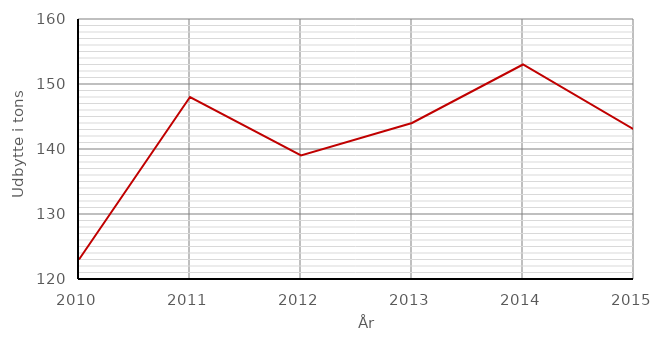
| Category | Series 0 |
|---|---|
| 2010 | 123 |
| 2011 | 148 |
| 2012 | 139 |
| 2013 | 144 |
| 2014 | 153 |
| 2015 | 143 |